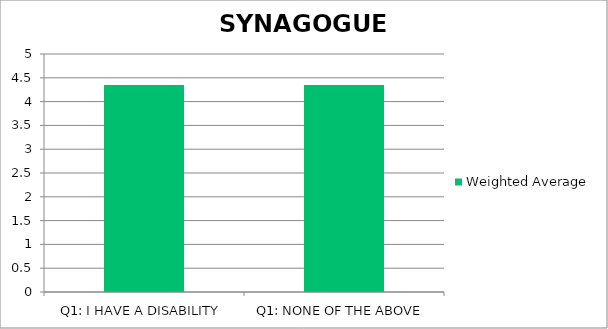
| Category | Weighted Average |
|---|---|
| Q1: I HAVE A DISABILITY | 4.35 |
| Q1: NONE OF THE ABOVE | 4.35 |